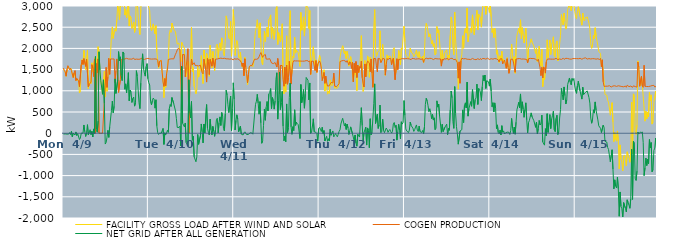
| Category | FACILITY GROSS LOAD AFTER WIND AND SOLAR | COGEN PRODUCTION | NET GRID AFTER ALL GENERATION |
|---|---|---|---|
|  Mon  4/9 | 1517 | 1535 | -18 |
|  Mon  4/9 | 1476 | 1479 | -3 |
|  Mon  4/9 | 1431 | 1447 | -16 |
|  Mon  4/9 | 1342 | 1345 | -3 |
|  Mon  4/9 | 1487 | 1508 | -21 |
|  Mon  4/9 | 1585 | 1593 | -8 |
|  Mon  4/9 | 1550 | 1570 | -20 |
|  Mon  4/9 | 1511 | 1496 | 15 |
|  Mon  4/9 | 1497 | 1530 | -33 |
|  Mon  4/9 | 1519 | 1474 | 45 |
|  Mon  4/9 | 1371 | 1456 | -85 |
|  Mon  4/9 | 1315 | 1314 | 1 |
|  Mon  4/9 | 1419 | 1424 | -5 |
|  Mon  4/9 | 1433 | 1476 | -43 |
|  Mon  4/9 | 1274 | 1244 | 30 |
|  Mon  4/9 | 1236 | 1292 | -56 |
|  Mon  4/9 | 1280 | 1290 | -10 |
|  Mon  4/9 | 1226 | 1231 | -5 |
|  Mon  4/9 | 949 | 1098 | -149 |
|  Mon  4/9 | 996 | 1113 | -117 |
|  Mon  4/9 | 1609 | 1608 | 1 |
|  Mon  4/9 | 1737 | 1727 | 10 |
|  Mon  4/9 | 1623 | 1622 | 1 |
|  Mon  4/9 | 1953 | 1759 | 194 |
|  Mon  4/9 | 1786 | 1750 | 36 |
|  Mon  4/9 | 1500 | 1577 | -77 |
|  Mon  4/9 | 1761 | 1746 | 15 |
|  Mon  4/9 | 1953 | 1752 | 201 |
|  Mon  4/9 | 1054 | 1094 | -40 |
|  Mon  4/9 | 1178 | 1151 | 27 |
|  Mon  4/9 | 1228 | 1145 | 83 |
|  Mon  4/9 | 1171 | 1206 | -35 |
|  Mon  4/9 | 1660 | 1616 | 44 |
|  Mon  4/9 | 1442 | 1531 | -89 |
|  Mon  4/9 | 1437 | 1336 | 101 |
|  Mon  4/9 | 1747 | 1752 | -5 |
|  Mon  4/9 | 1807 | 0 | 1807 |
|  Mon  4/9 | 1733 | 1643 | 90 |
|  Mon  4/9 | 1451 | 1428 | 23 |
|  Mon  4/9 | 2040 | 1752 | 288 |
|  Mon  4/9 | 1921 | 0 | 1921 |
|  Mon  4/9 | 1490 | 0 | 1490 |
|  Mon  4/9 | 1237 | 0 | 1237 |
|  Mon  4/9 | 1243 | 0 | 1243 |
|  Mon  4/9 | 918 | 0 | 918 |
|  Mon  4/9 | 1259 | 0 | 1259 |
|  Mon  4/9 | 1459 | 760 | 699 |
|  Mon  4/9 | 859 | 1115 | -256 |
|  Mon  4/9 | 1334 | 1552 | -218 |
|  Mon  4/9 | 988 | 1081 | -93 |
|  Mon  4/9 | 1399 | 1332 | 67 |
|  Mon  4/9 | 1668 | 1766 | -98 |
|  Mon  4/9 | 1531 | 1388 | 143 |
|  Mon  4/9 | 1885 | 1751 | 134 |
|  Mon  4/9 | 2299 | 1760 | 539 |
|  Mon  4/9 | 2507 | 1751 | 756 |
|  Mon  4/9 | 2235 | 1753 | 482 |
|  Mon  4/9 | 2385 | 1751 | 634 |
|  Mon  4/9 | 2473 | 1192 | 1281 |
|  Mon  4/9 | 2404 | 1466 | 938 |
|  Mon  4/9 | 2673 | 1752 | 921 |
|  Mon  4/9 | 3011 | 1756 | 1255 |
|  Mon  4/9 | 2888 | 963 | 1925 |
|  Mon  4/9 | 2675 | 970 | 1705 |
|  Mon  4/9 | 3060 | 1259 | 1801 |
|  Mon  4/9 | 3095 | 1738 | 1357 |
|  Mon  4/9 | 2992 | 1752 | 1240 |
|  Mon  4/9 | 3663 | 1747 | 1916 |
|  Mon  4/9 | 3623 | 1748 | 1875 |
|  Mon  4/9 | 2786 | 1749 | 1037 |
|  Mon  4/9 | 2916 | 1752 | 1164 |
|  Mon  4/9 | 2718 | 1766 | 952 |
|  Mon  4/9 | 2916 | 1763 | 1153 |
|  Mon  4/9 | 3179 | 1750 | 1429 |
|  Mon  4/9 | 2527 | 1762 | 765 |
|  Mon  4/9 | 2767 | 1749 | 1018 |
|  Mon  4/9 | 2719 | 1750 | 969 |
|  Mon  4/9 | 2471 | 1746 | 725 |
|  Mon  4/9 | 2560 | 1742 | 818 |
|  Mon  4/9 | 2624 | 1771 | 853 |
|  Mon  4/9 | 2376 | 1738 | 638 |
|  Mon  4/9 | 2462 | 1747 | 715 |
|  Mon  4/9 | 3223 | 1748 | 1475 |
|  Mon  4/9 | 3108 | 1767 | 1341 |
|  Mon  4/9 | 2767 | 1743 | 1024 |
|  Mon  4/9 | 2463 | 1742 | 721 |
|  Mon  4/9 | 2326 | 1746 | 580 |
|  Mon  4/9 | 2919 | 1738 | 1181 |
|  Mon  4/9 | 3330 | 1767 | 1563 |
|  Mon  4/9 | 3614 | 1742 | 1872 |
|  Mon  4/9 | 3267 | 1729 | 1538 |
|  Mon  4/9 | 3161 | 1740 | 1421 |
|  Mon  4/9 | 3095 | 1749 | 1346 |
|  Mon  4/9 | 3325 | 1756 | 1569 |
|  Mon  4/9 | 3381 | 1740 | 1641 |
|  Mon  4/9 | 3047 | 1765 | 1282 |
|  Tue  4/10 | 2956 | 1767 | 1189 |
|  Tue  4/10 | 2891 | 1753 | 1138 |
|  Tue  4/10 | 2488 | 1748 | 740 |
|  Tue  4/10 | 2417 | 1748 | 669 |
|  Tue  4/10 | 2519 | 1747 | 772 |
|  Tue  4/10 | 2578 | 1750 | 828 |
|  Tue  4/10 | 2563 | 1764 | 799 |
|  Tue  4/10 | 2343 | 1752 | 591 |
|  Tue  4/10 | 2537 | 1749 | 788 |
|  Tue  4/10 | 1921 | 1747 | 174 |
|  Tue  4/10 | 1729 | 1717 | 12 |
|  Tue  4/10 | 1534 | 1563 | -29 |
|  Tue  4/10 | 1695 | 1693 | 2 |
|  Tue  4/10 | 1692 | 1702 | -10 |
|  Tue  4/10 | 1714 | 1715 | -1 |
|  Tue  4/10 | 1420 | 1441 | -21 |
|  Tue  4/10 | 1318 | 1205 | 113 |
|  Tue  4/10 | 838 | 1103 | -265 |
|  Tue  4/10 | 1297 | 1288 | 9 |
|  Tue  4/10 | 1083 | 1119 | -36 |
|  Tue  4/10 | 1406 | 1403 | 3 |
|  Tue  4/10 | 1583 | 1512 | 71 |
|  Tue  4/10 | 1760 | 1740 | 20 |
|  Tue  4/10 | 2329 | 1757 | 572 |
|  Tue  4/10 | 2429 | 1750 | 679 |
|  Tue  4/10 | 2380 | 1750 | 630 |
|  Tue  4/10 | 2596 | 1755 | 841 |
|  Tue  4/10 | 2602 | 1757 | 845 |
|  Tue  4/10 | 2448 | 1751 | 697 |
|  Tue  4/10 | 2423 | 1749 | 674 |
|  Tue  4/10 | 2389 | 1862 | 527 |
|  Tue  4/10 | 2253 | 1905 | 348 |
|  Tue  4/10 | 2101 | 1965 | 136 |
|  Tue  4/10 | 2119 | 1999 | 120 |
|  Tue  4/10 | 2127 | 1991 | 136 |
|  Tue  4/10 | 2140 | 1974 | 166 |
|  Tue  4/10 | 1684 | 1986 | -302 |
|  Tue  4/10 | 2141 | 566 | 1575 |
|  Tue  4/10 | 2089 | 1853 | 236 |
|  Tue  4/10 | 2097 | 1850 | 247 |
|  Tue  4/10 | 2005 | 1855 | 150 |
|  Tue  4/10 | 1572 | 1331 | 241 |
|  Tue  4/10 | 1333 | 1554 | -221 |
|  Tue  4/10 | 1333 | 1539 | -206 |
|  Tue  4/10 | 1694 | 1993 | -299 |
|  Tue  4/10 | 1259 | 0 | 1259 |
|  Tue  4/10 | 1555 | 1039 | 516 |
|  Tue  4/10 | 1867 | 1508 | 359 |
|  Tue  4/10 | 2496 | 1749 | 747 |
|  Tue  4/10 | 1444 | 1610 | -166 |
|  Tue  4/10 | 1551 | 1624 | -73 |
|  Tue  4/10 | 1103 | 1661 | -558 |
|  Tue  4/10 | 1033 | 1601 | -568 |
|  Tue  4/10 | 930 | 1604 | -674 |
|  Tue  4/10 | 1035 | 1594 | -559 |
|  Tue  4/10 | 1577 | 1607 | -30 |
|  Tue  4/10 | 1323 | 1586 | -263 |
|  Tue  4/10 | 1333 | 1607 | -274 |
|  Tue  4/10 | 1536 | 1603 | -67 |
|  Tue  4/10 | 1830 | 1612 | 218 |
|  Tue  4/10 | 1461 | 1428 | 33 |
|  Tue  4/10 | 1171 | 1400 | -229 |
|  Tue  4/10 | 1962 | 1746 | 216 |
|  Tue  4/10 | 1748 | 1740 | 8 |
|  Tue  4/10 | 1517 | 1486 | 31 |
|  Tue  4/10 | 1880 | 1206 | 674 |
|  Tue  4/10 | 1878 | 1761 | 117 |
|  Tue  4/10 | 1720 | 1699 | 21 |
|  Tue  4/10 | 1343 | 1383 | -40 |
|  Tue  4/10 | 2072 | 1741 | 331 |
|  Tue  4/10 | 1833 | 1755 | 78 |
|  Tue  4/10 | 1541 | 1581 | -40 |
|  Tue  4/10 | 1929 | 1769 | 160 |
|  Tue  4/10 | 1815 | 1763 | 52 |
|  Tue  4/10 | 1471 | 1545 | -74 |
|  Tue  4/10 | 1824 | 1746 | 78 |
|  Tue  4/10 | 2070 | 1755 | 315 |
|  Tue  4/10 | 2102 | 1750 | 352 |
|  Tue  4/10 | 1775 | 1768 | 7 |
|  Tue  4/10 | 2013 | 1762 | 251 |
|  Tue  4/10 | 2129 | 1744 | 385 |
|  Tue  4/10 | 1952 | 1770 | 182 |
|  Tue  4/10 | 2248 | 1762 | 486 |
|  Tue  4/10 | 2154 | 1761 | 393 |
|  Tue  4/10 | 1861 | 1755 | 106 |
|  Tue  4/10 | 1820 | 1767 | 53 |
|  Tue  4/10 | 2221 | 1763 | 458 |
|  Tue  4/10 | 2767 | 1754 | 1013 |
|  Tue  4/10 | 2669 | 1766 | 903 |
|  Tue  4/10 | 2424 | 1754 | 670 |
|  Tue  4/10 | 2244 | 1759 | 485 |
|  Tue  4/10 | 2218 | 1747 | 471 |
|  Tue  4/10 | 2635 | 1762 | 873 |
|  Tue  4/10 | 1816 | 1754 | 62 |
|  Tue  4/10 | 2340 | 1754 | 586 |
|  Tue  4/10 | 2917 | 1729 | 1188 |
|  Wed  4/11 | 2554 | 1756 | 798 |
|  Wed  4/11 | 1833 | 1758 | 75 |
|  Wed  4/11 | 2048 | 1747 | 301 |
|  Wed  4/11 | 2185 | 1751 | 434 |
|  Wed  4/11 | 2089 | 1754 | 335 |
|  Wed  4/11 | 1792 | 1760 | 32 |
|  Wed  4/11 | 1765 | 1730 | 35 |
|  Wed  4/11 | 1912 | 1747 | 165 |
|  Wed  4/11 | 1651 | 1673 | -22 |
|  Wed  4/11 | 1561 | 1576 | -15 |
|  Wed  4/11 | 1614 | 1656 | -42 |
|  Wed  4/11 | 1365 | 1357 | 8 |
|  Wed  4/11 | 1787 | 1755 | 32 |
|  Wed  4/11 | 1554 | 1556 | -2 |
|  Wed  4/11 | 1370 | 1402 | -32 |
|  Wed  4/11 | 1143 | 1191 | -48 |
|  Wed  4/11 | 1357 | 1386 | -29 |
|  Wed  4/11 | 1558 | 1566 | -8 |
|  Wed  4/11 | 1602 | 1592 | 10 |
|  Wed  4/11 | 1615 | 1610 | 5 |
|  Wed  4/11 | 1597 | 1594 | 3 |
|  Wed  4/11 | 1567 | 1590 | -23 |
|  Wed  4/11 | 1656 | 1700 | -44 |
|  Wed  4/11 | 2201 | 1746 | 455 |
|  Wed  4/11 | 2423 | 1742 | 681 |
|  Wed  4/11 | 2496 | 1742 | 754 |
|  Wed  4/11 | 2675 | 1758 | 917 |
|  Wed  4/11 | 2467 | 1760 | 707 |
|  Wed  4/11 | 2251 | 1803 | 448 |
|  Wed  4/11 | 2602 | 1857 | 745 |
|  Wed  4/11 | 2146 | 1902 | 244 |
|  Wed  4/11 | 1665 | 1903 | -238 |
|  Wed  4/11 | 1614 | 1789 | -175 |
|  Wed  4/11 | 2017 | 1831 | 186 |
|  Wed  4/11 | 2403 | 1832 | 571 |
|  Wed  4/11 | 2162 | 1857 | 305 |
|  Wed  4/11 | 2359 | 1748 | 611 |
|  Wed  4/11 | 2499 | 1752 | 747 |
|  Wed  4/11 | 2273 | 1747 | 526 |
|  Wed  4/11 | 2678 | 1756 | 922 |
|  Wed  4/11 | 2720 | 1757 | 963 |
|  Wed  4/11 | 2791 | 1739 | 1052 |
|  Wed  4/11 | 2239 | 1657 | 582 |
|  Wed  4/11 | 2497 | 1656 | 841 |
|  Wed  4/11 | 2402 | 1641 | 761 |
|  Wed  4/11 | 2212 | 1644 | 568 |
|  Wed  4/11 | 2429 | 1666 | 763 |
|  Wed  4/11 | 2942 | 1671 | 1271 |
|  Wed  4/11 | 2986 | 1560 | 1426 |
|  Wed  4/11 | 2094 | 1762 | 332 |
|  Wed  4/11 | 2373 | 1604 | 769 |
|  Wed  4/11 | 2372 | 935 | 1437 |
|  Wed  4/11 | 2158 | 1599 | 559 |
|  Wed  4/11 | 2314 | 1595 | 719 |
|  Wed  4/11 | 2581 | 1595 | 986 |
|  Wed  4/11 | 1432 | 1263 | 169 |
|  Wed  4/11 | 929 | 1108 | -179 |
|  Wed  4/11 | 1490 | 1558 | -68 |
|  Wed  4/11 | 970 | 1170 | -200 |
|  Wed  4/11 | 2297 | 1607 | 690 |
|  Wed  4/11 | 1168 | 1155 | 13 |
|  Wed  4/11 | 1437 | 1305 | 132 |
|  Wed  4/11 | 2538 | 1696 | 842 |
|  Wed  4/11 | 2890 | 1708 | 1182 |
|  Wed  4/11 | 1308 | 1159 | 149 |
|  Wed  4/11 | 1468 | 1494 | -26 |
|  Wed  4/11 | 1815 | 1662 | 153 |
|  Wed  4/11 | 1772 | 1709 | 63 |
|  Wed  4/11 | 2262 | 1710 | 552 |
|  Wed  4/11 | 1889 | 1704 | 185 |
|  Wed  4/11 | 1956 | 1698 | 258 |
|  Wed  4/11 | 1931 | 1705 | 226 |
|  Wed  4/11 | 1902 | 1700 | 202 |
|  Wed  4/11 | 1889 | 1702 | 187 |
|  Wed  4/11 | 1574 | 1700 | -126 |
|  Wed  4/11 | 2848 | 1700 | 1148 |
|  Wed  4/11 | 2428 | 1709 | 719 |
|  Wed  4/11 | 2560 | 1699 | 861 |
|  Wed  4/11 | 2746 | 1718 | 1028 |
|  Wed  4/11 | 2290 | 1700 | 590 |
|  Wed  4/11 | 2635 | 1712 | 923 |
|  Wed  4/11 | 3027 | 1712 | 1315 |
|  Wed  4/11 | 2981 | 1700 | 1281 |
|  Wed  4/11 | 2956 | 1707 | 1249 |
|  Wed  4/11 | 2468 | 1682 | 786 |
|  Wed  4/11 | 2893 | 1708 | 1185 |
|  Wed  4/11 | 1382 | 1387 | -5 |
|  Wed  4/11 | 1717 | 1698 | 19 |
|  Wed  4/11 | 1863 | 1693 | 170 |
|  Wed  4/11 | 2039 | 1700 | 339 |
|  Wed  4/11 | 1737 | 1705 | 32 |
|  Wed  4/11 | 1492 | 1478 | 14 |
|  Wed  4/11 | 1732 | 1712 | 20 |
|  Wed  4/11 | 1433 | 1437 | -4 |
|  Wed  4/11 | 1437 | 1627 | -190 |
|  Wed  4/11 | 1724 | 1616 | 108 |
|  Thu  4/12 | 1841 | 1704 | 137 |
|  Thu  4/12 | 1749 | 1654 | 95 |
|  Thu  4/12 | 1564 | 1524 | 40 |
|  Thu  4/12 | 1382 | 1241 | 141 |
|  Thu  4/12 | 1322 | 1330 | -8 |
|  Thu  4/12 | 1495 | 1434 | 61 |
|  Thu  4/12 | 993 | 1177 | -184 |
|  Thu  4/12 | 1221 | 1347 | -126 |
|  Thu  4/12 | 1120 | 1192 | -72 |
|  Thu  4/12 | 921 | 1111 | -190 |
|  Thu  4/12 | 994 | 1125 | -131 |
|  Thu  4/12 | 939 | 1119 | -180 |
|  Thu  4/12 | 1256 | 1164 | 92 |
|  Thu  4/12 | 1149 | 1198 | -49 |
|  Thu  4/12 | 1120 | 1186 | -66 |
|  Thu  4/12 | 1239 | 1186 | 53 |
|  Thu  4/12 | 1331 | 1418 | -87 |
|  Thu  4/12 | 1061 | 1111 | -50 |
|  Thu  4/12 | 1098 | 1108 | -10 |
|  Thu  4/12 | 1046 | 1095 | -49 |
|  Thu  4/12 | 1036 | 1120 | -84 |
|  Thu  4/12 | 1091 | 1118 | -27 |
|  Thu  4/12 | 1210 | 1168 | 42 |
|  Thu  4/12 | 1768 | 1689 | 79 |
|  Thu  4/12 | 1913 | 1695 | 218 |
|  Thu  4/12 | 1994 | 1707 | 287 |
|  Thu  4/12 | 2062 | 1710 | 352 |
|  Thu  4/12 | 2060 | 1716 | 344 |
|  Thu  4/12 | 1873 | 1704 | 169 |
|  Thu  4/12 | 1935 | 1704 | 231 |
|  Thu  4/12 | 1761 | 1673 | 88 |
|  Thu  4/12 | 1929 | 1713 | 216 |
|  Thu  4/12 | 1826 | 1701 | 125 |
|  Thu  4/12 | 1581 | 1611 | -30 |
|  Thu  4/12 | 1738 | 1687 | 51 |
|  Thu  4/12 | 1806 | 1657 | 149 |
|  Thu  4/12 | 1659 | 1529 | 130 |
|  Thu  4/12 | 1657 | 1670 | -13 |
|  Thu  4/12 | 1211 | 1212 | -1 |
|  Thu  4/12 | 1464 | 1647 | -183 |
|  Thu  4/12 | 1384 | 1426 | -42 |
|  Thu  4/12 | 1457 | 1690 | -233 |
|  Thu  4/12 | 1006 | 1313 | -307 |
|  Thu  4/12 | 1583 | 1606 | -23 |
|  Thu  4/12 | 1421 | 1434 | -13 |
|  Thu  4/12 | 1480 | 1571 | -91 |
|  Thu  4/12 | 1834 | 1542 | 292 |
|  Thu  4/12 | 2301 | 1699 | 602 |
|  Thu  4/12 | 1486 | 1307 | 179 |
|  Thu  4/12 | 985 | 1174 | -189 |
|  Thu  4/12 | 1103 | 1089 | 14 |
|  Thu  4/12 | 1716 | 1633 | 83 |
|  Thu  4/12 | 1468 | 1328 | 140 |
|  Thu  4/12 | 1348 | 1628 | -280 |
|  Thu  4/12 | 1823 | 1699 | 124 |
|  Thu  4/12 | 1765 | 1698 | 67 |
|  Thu  4/12 | 1317 | 1660 | -343 |
|  Thu  4/12 | 1791 | 1450 | 341 |
|  Thu  4/12 | 1713 | 1750 | -37 |
|  Thu  4/12 | 1433 | 1417 | 16 |
|  Thu  4/12 | 1088 | 1082 | 6 |
|  Thu  4/12 | 2456 | 1760 | 696 |
|  Thu  4/12 | 2914 | 1750 | 1164 |
|  Thu  4/12 | 1994 | 1764 | 230 |
|  Thu  4/12 | 1810 | 1588 | 222 |
|  Thu  4/12 | 1897 | 1450 | 447 |
|  Thu  4/12 | 1878 | 1765 | 113 |
|  Thu  4/12 | 1955 | 1761 | 194 |
|  Thu  4/12 | 2416 | 1753 | 663 |
|  Thu  4/12 | 1676 | 1662 | 14 |
|  Thu  4/12 | 1745 | 1704 | 41 |
|  Thu  4/12 | 2095 | 1765 | 330 |
|  Thu  4/12 | 1808 | 1745 | 63 |
|  Thu  4/12 | 1766 | 1753 | 13 |
|  Thu  4/12 | 1362 | 1370 | -8 |
|  Thu  4/12 | 1739 | 1618 | 121 |
|  Thu  4/12 | 1848 | 1761 | 87 |
|  Thu  4/12 | 1750 | 1730 | 20 |
|  Thu  4/12 | 1819 | 1760 | 59 |
|  Thu  4/12 | 1834 | 1747 | 87 |
|  Thu  4/12 | 1805 | 1764 | 41 |
|  Thu  4/12 | 1617 | 1615 | 2 |
|  Thu  4/12 | 1763 | 1724 | 39 |
|  Thu  4/12 | 1985 | 1769 | 216 |
|  Thu  4/12 | 2018 | 1766 | 252 |
|  Thu  4/12 | 1395 | 1260 | 135 |
|  Thu  4/12 | 1444 | 1256 | 188 |
|  Thu  4/12 | 1593 | 1756 | -163 |
|  Thu  4/12 | 1537 | 1499 | 38 |
|  Thu  4/12 | 1950 | 1740 | 210 |
|  Thu  4/12 | 1818 | 1754 | 64 |
|  Thu  4/12 | 1609 | 1743 | -134 |
|  Thu  4/12 | 2012 | 1743 | 269 |
|  Thu  4/12 | 1976 | 1761 | 215 |
|  Thu  4/12 | 1993 | 1741 | 252 |
|  Thu  4/12 | 2523 | 1753 | 770 |
|  Fri  4/13 | 2157 | 1737 | 420 |
|  Fri  4/13 | 1861 | 1760 | 101 |
|  Fri  4/13 | 1816 | 1763 | 53 |
|  Fri  4/13 | 1820 | 1757 | 63 |
|  Fri  4/13 | 1760 | 1746 | 14 |
|  Fri  4/13 | 1824 | 1752 | 72 |
|  Fri  4/13 | 2006 | 1742 | 264 |
|  Fri  4/13 | 1915 | 1734 | 181 |
|  Fri  4/13 | 1925 | 1765 | 160 |
|  Fri  4/13 | 1868 | 1751 | 117 |
|  Fri  4/13 | 1801 | 1759 | 42 |
|  Fri  4/13 | 1823 | 1739 | 84 |
|  Fri  4/13 | 1892 | 1747 | 145 |
|  Fri  4/13 | 1960 | 1765 | 195 |
|  Fri  4/13 | 1826 | 1753 | 73 |
|  Fri  4/13 | 1784 | 1744 | 40 |
|  Fri  4/13 | 1924 | 1756 | 168 |
|  Fri  4/13 | 1772 | 1734 | 38 |
|  Fri  4/13 | 1798 | 1740 | 58 |
|  Fri  4/13 | 1766 | 1749 | 17 |
|  Fri  4/13 | 1820 | 1755 | 65 |
|  Fri  4/13 | 1659 | 1671 | -12 |
|  Fri  4/13 | 1891 | 1742 | 149 |
|  Fri  4/13 | 2431 | 1751 | 680 |
|  Fri  4/13 | 2592 | 1769 | 823 |
|  Fri  4/13 | 2526 | 1763 | 763 |
|  Fri  4/13 | 2404 | 1754 | 650 |
|  Fri  4/13 | 2268 | 1759 | 509 |
|  Fri  4/13 | 2343 | 1767 | 576 |
|  Fri  4/13 | 2250 | 1760 | 490 |
|  Fri  4/13 | 2104 | 1761 | 343 |
|  Fri  4/13 | 2186 | 1741 | 445 |
|  Fri  4/13 | 2046 | 1736 | 310 |
|  Fri  4/13 | 2109 | 1746 | 363 |
|  Fri  4/13 | 1845 | 1762 | 83 |
|  Fri  4/13 | 1872 | 1753 | 119 |
|  Fri  4/13 | 2517 | 1754 | 763 |
|  Fri  4/13 | 2365 | 1750 | 615 |
|  Fri  4/13 | 2438 | 1752 | 686 |
|  Fri  4/13 | 2152 | 1747 | 405 |
|  Fri  4/13 | 2169 | 1753 | 416 |
|  Fri  4/13 | 1602 | 1582 | 20 |
|  Fri  4/13 | 1956 | 1747 | 209 |
|  Fri  4/13 | 1758 | 1720 | 38 |
|  Fri  4/13 | 1783 | 1755 | 28 |
|  Fri  4/13 | 1899 | 1757 | 142 |
|  Fri  4/13 | 1882 | 1750 | 132 |
|  Fri  4/13 | 1966 | 1753 | 213 |
|  Fri  4/13 | 1731 | 1766 | -35 |
|  Fri  4/13 | 1843 | 1728 | 115 |
|  Fri  4/13 | 1778 | 1711 | 67 |
|  Fri  4/13 | 2309 | 1759 | 550 |
|  Fri  4/13 | 2742 | 1747 | 995 |
|  Fri  4/13 | 2604 | 1768 | 836 |
|  Fri  4/13 | 2032 | 1758 | 274 |
|  Fri  4/13 | 1849 | 1735 | 114 |
|  Fri  4/13 | 2856 | 1758 | 1098 |
|  Fri  4/13 | 2212 | 1744 | 468 |
|  Fri  4/13 | 1909 | 1755 | 154 |
|  Fri  4/13 | 1647 | 1663 | -16 |
|  Fri  4/13 | 1039 | 1298 | -259 |
|  Fri  4/13 | 1402 | 1682 | -280 |
|  Fri  4/13 | 1230 | 1178 | 52 |
|  Fri  4/13 | 1759 | 1706 | 53 |
|  Fri  4/13 | 1849 | 1767 | 82 |
|  Fri  4/13 | 2298 | 1748 | 550 |
|  Fri  4/13 | 2004 | 1753 | 251 |
|  Fri  4/13 | 2404 | 1749 | 655 |
|  Fri  4/13 | 2475 | 1759 | 716 |
|  Fri  4/13 | 2360 | 1765 | 595 |
|  Fri  4/13 | 2951 | 1745 | 1206 |
|  Fri  4/13 | 2157 | 1755 | 402 |
|  Fri  4/13 | 2324 | 1743 | 581 |
|  Fri  4/13 | 2355 | 1752 | 603 |
|  Fri  4/13 | 2480 | 1736 | 744 |
|  Fri  4/13 | 2378 | 1742 | 636 |
|  Fri  4/13 | 2791 | 1763 | 1028 |
|  Fri  4/13 | 2788 | 1771 | 1017 |
|  Fri  4/13 | 2324 | 1741 | 583 |
|  Fri  4/13 | 2548 | 1754 | 794 |
|  Fri  4/13 | 2566 | 1734 | 832 |
|  Fri  4/13 | 2901 | 1744 | 1157 |
|  Fri  4/13 | 2435 | 1757 | 678 |
|  Fri  4/13 | 2804 | 1748 | 1056 |
|  Fri  4/13 | 2767 | 1736 | 1031 |
|  Fri  4/13 | 2710 | 1763 | 947 |
|  Fri  4/13 | 2501 | 1732 | 769 |
|  Fri  4/13 | 2861 | 1761 | 1100 |
|  Fri  4/13 | 3124 | 1763 | 1361 |
|  Fri  4/13 | 2995 | 1760 | 1235 |
|  Fri  4/13 | 3124 | 1752 | 1372 |
|  Fri  4/13 | 2803 | 1747 | 1056 |
|  Fri  4/13 | 2997 | 1760 | 1237 |
|  Fri  4/13 | 2989 | 1768 | 1221 |
|  Fri  4/13 | 2957 | 1745 | 1212 |
|  Fri  4/13 | 2849 | 1739 | 1110 |
|  Sat  4/14 | 3028 | 1750 | 1278 |
|  Sat  4/14 | 2747 | 1757 | 990 |
|  Sat  4/14 | 2377 | 1753 | 624 |
|  Sat  4/14 | 2465 | 1746 | 719 |
|  Sat  4/14 | 2257 | 1754 | 503 |
|  Sat  4/14 | 2476 | 1761 | 715 |
|  Sat  4/14 | 2330 | 1747 | 583 |
|  Sat  4/14 | 1862 | 1753 | 109 |
|  Sat  4/14 | 1956 | 1760 | 196 |
|  Sat  4/14 | 1744 | 1728 | 16 |
|  Sat  4/14 | 1665 | 1681 | -16 |
|  Sat  4/14 | 1826 | 1751 | 75 |
|  Sat  4/14 | 1706 | 1745 | -39 |
|  Sat  4/14 | 1933 | 1756 | 177 |
|  Sat  4/14 | 1655 | 1633 | 22 |
|  Sat  4/14 | 1743 | 1688 | 55 |
|  Sat  4/14 | 1708 | 1726 | -18 |
|  Sat  4/14 | 1719 | 1712 | 7 |
|  Sat  4/14 | 1554 | 1530 | 24 |
|  Sat  4/14 | 1781 | 1756 | 25 |
|  Sat  4/14 | 1566 | 1556 | 10 |
|  Sat  4/14 | 1433 | 1412 | 21 |
|  Sat  4/14 | 1493 | 1523 | -30 |
|  Sat  4/14 | 1802 | 1742 | 60 |
|  Sat  4/14 | 2102 | 1754 | 348 |
|  Sat  4/14 | 1866 | 1748 | 118 |
|  Sat  4/14 | 1672 | 1679 | -7 |
|  Sat  4/14 | 1804 | 1660 | 144 |
|  Sat  4/14 | 1414 | 1438 | -24 |
|  Sat  4/14 | 2009 | 1749 | 260 |
|  Sat  4/14 | 2305 | 1751 | 554 |
|  Sat  4/14 | 2326 | 1756 | 570 |
|  Sat  4/14 | 2480 | 1752 | 728 |
|  Sat  4/14 | 2358 | 1761 | 597 |
|  Sat  4/14 | 2674 | 1748 | 926 |
|  Sat  4/14 | 2225 | 1748 | 477 |
|  Sat  4/14 | 2489 | 1749 | 740 |
|  Sat  4/14 | 2319 | 1750 | 569 |
|  Sat  4/14 | 2130 | 1755 | 375 |
|  Sat  4/14 | 2307 | 1747 | 560 |
|  Sat  4/14 | 2480 | 1763 | 717 |
|  Sat  4/14 | 2053 | 1738 | 315 |
|  Sat  4/14 | 1665 | 1660 | 5 |
|  Sat  4/14 | 2002 | 1755 | 247 |
|  Sat  4/14 | 2065 | 1761 | 304 |
|  Sat  4/14 | 2060 | 1765 | 295 |
|  Sat  4/14 | 2226 | 1747 | 479 |
|  Sat  4/14 | 2144 | 1760 | 384 |
|  Sat  4/14 | 2126 | 1760 | 366 |
|  Sat  4/14 | 2057 | 1761 | 296 |
|  Sat  4/14 | 1967 | 1750 | 217 |
|  Sat  4/14 | 1882 | 1744 | 138 |
|  Sat  4/14 | 2009 | 1748 | 261 |
|  Sat  4/14 | 1691 | 1710 | -19 |
|  Sat  4/14 | 1856 | 1746 | 110 |
|  Sat  4/14 | 2055 | 1754 | 301 |
|  Sat  4/14 | 1734 | 1540 | 194 |
|  Sat  4/14 | 1579 | 1357 | 222 |
|  Sat  4/14 | 1976 | 1550 | 426 |
|  Sat  4/14 | 1098 | 1304 | -206 |
|  Sat  4/14 | 1355 | 1564 | -209 |
|  Sat  4/14 | 1255 | 1537 | -282 |
|  Sat  4/14 | 1525 | 1417 | 108 |
|  Sat  4/14 | 1623 | 1684 | -61 |
|  Sat  4/14 | 2204 | 1744 | 460 |
|  Sat  4/14 | 1777 | 1759 | 18 |
|  Sat  4/14 | 2003 | 1751 | 252 |
|  Sat  4/14 | 2198 | 1759 | 439 |
|  Sat  4/14 | 1856 | 1747 | 109 |
|  Sat  4/14 | 2093 | 1762 | 331 |
|  Sat  4/14 | 2168 | 1746 | 422 |
|  Sat  4/14 | 2274 | 1754 | 520 |
|  Sat  4/14 | 1827 | 1746 | 81 |
|  Sat  4/14 | 1792 | 1757 | 35 |
|  Sat  4/14 | 2115 | 1766 | 349 |
|  Sat  4/14 | 2177 | 1752 | 425 |
|  Sat  4/14 | 1707 | 1737 | -30 |
|  Sat  4/14 | 1778 | 1749 | 29 |
|  Sat  4/14 | 2108 | 1750 | 358 |
|  Sat  4/14 | 2305 | 1750 | 555 |
|  Sat  4/14 | 2798 | 1740 | 1058 |
|  Sat  4/14 | 2658 | 1742 | 916 |
|  Sat  4/14 | 2553 | 1767 | 786 |
|  Sat  4/14 | 2833 | 1742 | 1091 |
|  Sat  4/14 | 2631 | 1746 | 885 |
|  Sat  4/14 | 2455 | 1767 | 688 |
|  Sat  4/14 | 2534 | 1746 | 788 |
|  Sat  4/14 | 2909 | 1762 | 1147 |
|  Sat  4/14 | 2915 | 1770 | 1145 |
|  Sat  4/14 | 3052 | 1750 | 1302 |
|  Sat  4/14 | 2948 | 1748 | 1200 |
|  Sat  4/14 | 2886 | 1745 | 1141 |
|  Sat  4/14 | 3052 | 1761 | 1291 |
|  Sat  4/14 | 3002 | 1760 | 1242 |
|  Sat  4/14 | 3044 | 1754 | 1290 |
|  Sat  4/14 | 2874 | 1760 | 1114 |
|  Sun  4/15 | 2748 | 1755 | 993 |
|  Sun  4/15 | 2700 | 1760 | 940 |
|  Sun  4/15 | 2864 | 1743 | 1121 |
|  Sun  4/15 | 2983 | 1756 | 1227 |
|  Sun  4/15 | 2975 | 1753 | 1222 |
|  Sun  4/15 | 2759 | 1766 | 993 |
|  Sun  4/15 | 2736 | 1756 | 980 |
|  Sun  4/15 | 2548 | 1744 | 804 |
|  Sun  4/15 | 2833 | 1749 | 1084 |
|  Sun  4/15 | 2678 | 1766 | 912 |
|  Sun  4/15 | 2649 | 1755 | 894 |
|  Sun  4/15 | 2737 | 1778 | 959 |
|  Sun  4/15 | 2710 | 1763 | 947 |
|  Sun  4/15 | 2745 | 1748 | 997 |
|  Sun  4/15 | 2727 | 1742 | 985 |
|  Sun  4/15 | 2599 | 1759 | 840 |
|  Sun  4/15 | 2468 | 1758 | 710 |
|  Sun  4/15 | 2108 | 1751 | 357 |
|  Sun  4/15 | 2002 | 1767 | 235 |
|  Sun  4/15 | 2088 | 1758 | 330 |
|  Sun  4/15 | 2304 | 1751 | 553 |
|  Sun  4/15 | 2230 | 1756 | 474 |
|  Sun  4/15 | 2488 | 1750 | 738 |
|  Sun  4/15 | 2286 | 1747 | 539 |
|  Sun  4/15 | 2268 | 1751 | 517 |
|  Sun  4/15 | 2069 | 1756 | 313 |
|  Sun  4/15 | 1931 | 1757 | 174 |
|  Sun  4/15 | 1933 | 1738 | 195 |
|  Sun  4/15 | 1879 | 1764 | 115 |
|  Sun  4/15 | 1583 | 1569 | 14 |
|  Sun  4/15 | 1724 | 1731 | -7 |
|  Sun  4/15 | 1401 | 1211 | 190 |
|  Sun  4/15 | 1239 | 1103 | 136 |
|  Sun  4/15 | 914 | 1107 | -193 |
|  Sun  4/15 | 922 | 1109 | -187 |
|  Sun  4/15 | 897 | 1105 | -208 |
|  Sun  4/15 | 773 | 1109 | -336 |
|  Sun  4/15 | 732 | 1118 | -386 |
|  Sun  4/15 | 716 | 1120 | -404 |
|  Sun  4/15 | 425 | 1097 | -672 |
|  Sun  4/15 | 416 | 1089 | -673 |
|  Sun  4/15 | 720 | 1111 | -391 |
|  Sun  4/15 | 265 | 1113 | -848 |
|  Sun  4/15 | -201 | 1112 | -1313 |
|  Sun  4/15 | 18 | 1118 | -1100 |
|  Sun  4/15 | -141 | 1107 | -1248 |
|  Sun  4/15 | -188 | 1103 | -1291 |
|  Sun  4/15 | 53 | 1087 | -1034 |
|  Sun  4/15 | -192 | 1119 | -1311 |
|  Sun  4/15 | -841 | 1117 | -1958 |
|  Sun  4/15 | -276 | 1110 | -1386 |
|  Sun  4/15 | -612 | 1117 | -1729 |
|  Sun  4/15 | -683 | 1100 | -1783 |
|  Sun  4/15 | -886 | 1090 | -1976 |
|  Sun  4/15 | -542 | 1095 | -1637 |
|  Sun  4/15 | -513 | 1113 | -1626 |
|  Sun  4/15 | -659 | 1113 | -1772 |
|  Sun  4/15 | -774 | 1083 | -1857 |
|  Sun  4/15 | -438 | 1133 | -1571 |
|  Sun  4/15 | -518 | 1119 | -1637 |
|  Sun  4/15 | -601 | 1097 | -1698 |
|  Sun  4/15 | -686 | 1085 | -1771 |
|  Sun  4/15 | -433 | 1112 | -1545 |
|  Sun  4/15 | 732 | 1111 | -379 |
|  Sun  4/15 | -479 | 1082 | -1561 |
|  Sun  4/15 | 928 | 1117 | -189 |
|  Sun  4/15 | 897 | 1117 | -220 |
|  Sun  4/15 | 35 | 1100 | -1065 |
|  Sun  4/15 | -32 | 1082 | -1114 |
|  Sun  4/15 | 193 | 1087 | -894 |
|  Sun  4/15 | 1705 | 1678 | 27 |
|  Sun  4/15 | 1537 | 1557 | -20 |
|  Sun  4/15 | 1095 | 1108 | -13 |
|  Sun  4/15 | 1143 | 1111 | 32 |
|  Sun  4/15 | 1339 | 1338 | 1 |
|  Sun  4/15 | 1145 | 1114 | 31 |
|  Sun  4/15 | 863 | 1081 | -218 |
|  Sun  4/15 | 602 | 1602 | -1000 |
|  Sun  4/15 | 284 | 1105 | -821 |
|  Sun  4/15 | 520 | 1105 | -585 |
|  Sun  4/15 | 338 | 1101 | -763 |
|  Sun  4/15 | 494 | 1110 | -616 |
|  Sun  4/15 | 382 | 1101 | -719 |
|  Sun  4/15 | 961 | 1111 | -150 |
|  Sun  4/15 | 762 | 1110 | -348 |
|  Sun  4/15 | 903 | 1124 | -221 |
|  Sun  4/15 | 215 | 1123 | -908 |
|  Sun  4/15 | 268 | 1130 | -862 |
|  Sun  4/15 | 722 | 1128 | -406 |
|  Sun  4/15 | 740 | 1091 | -351 |
|  Sun  4/15 | 995 | 1111 | -116 |
|  Sun  4/15 | 744 | 1107 | -363 |